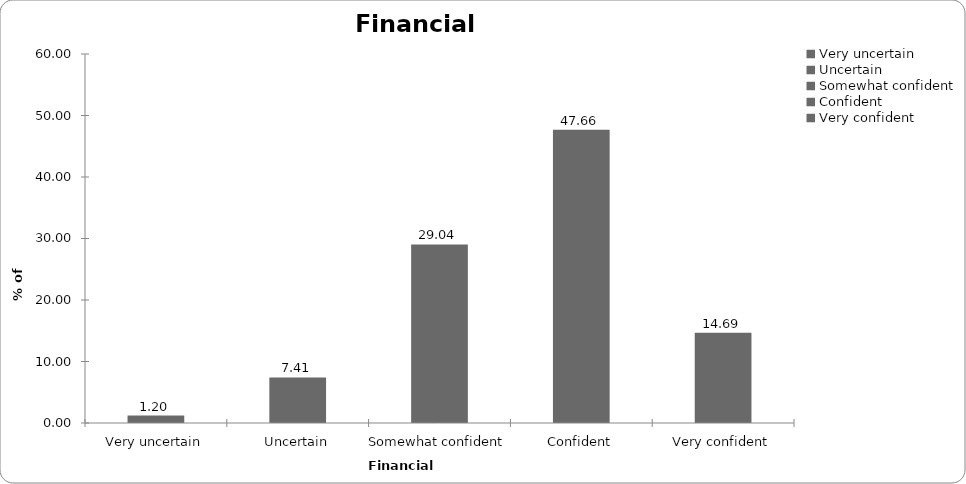
| Category | Financial confidence |
|---|---|
| Very uncertain | 1.202 |
| Uncertain | 7.41 |
| Somewhat confident | 29.039 |
| Confident | 47.664 |
| Very confident | 14.686 |